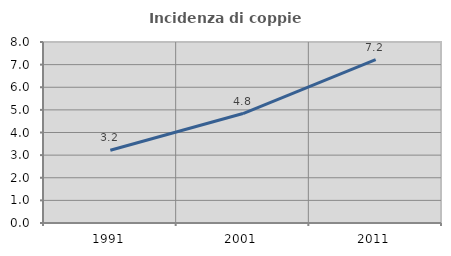
| Category | Incidenza di coppie miste |
|---|---|
| 1991.0 | 3.214 |
| 2001.0 | 4.839 |
| 2011.0 | 7.225 |